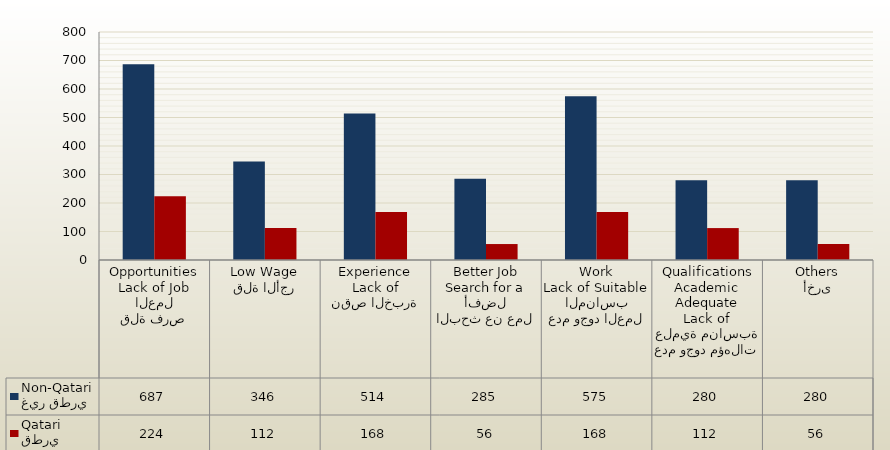
| Category | غير قطري
Non-Qatari | قطري
Qatari |
|---|---|---|
| قلة فرص العمل
Lack of Job Opportunities | 687 | 224 |
| قلة الأجر
Low Wage | 346 | 112 |
| نقص الخبرة
Lack of Experience | 514 | 168 |
| البحث عن عمل أفضل
Search for a Better Job | 285 | 56 |
| عدم وجود العمل المناسب
Lack of Suitable Work | 575 | 168 |
| عدم وجود مؤهلات علمية مناسبة
Lack of Adequate Academic Qualifications | 280 | 112 |
| أخرى
Others | 280 | 56 |